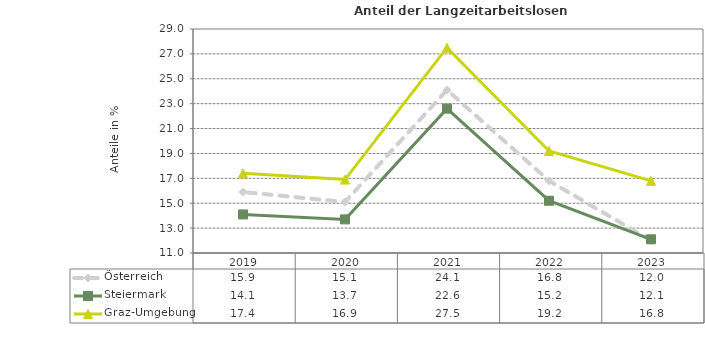
| Category | Österreich | Steiermark | Graz-Umgebung |
|---|---|---|---|
| 2023.0 | 12 | 12.1 | 16.8 |
| 2022.0 | 16.8 | 15.2 | 19.2 |
| 2021.0 | 24.1 | 22.6 | 27.5 |
| 2020.0 | 15.1 | 13.7 | 16.9 |
| 2019.0 | 15.9 | 14.1 | 17.4 |